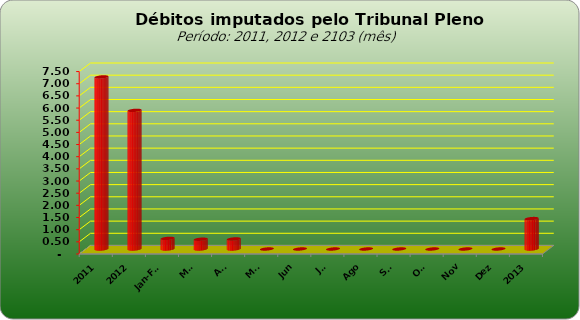
| Category |  7.073.154,74   5.698.720,25   436.112,79   401.482,76   413.229,26   -     -     -     -     -     -     -     -     1.250.824,81  |
|---|---|
| 2011 | 7073154.74 |
| 2012 | 5698720.25 |
| Jan-Fev | 436112.79 |
| Mar | 401482.76 |
| Abr | 413229.26 |
| Mai | 0 |
| Jun | 0 |
| Jul | 0 |
| Ago | 0 |
| Set | 0 |
| Out | 0 |
| Nov | 0 |
| Dez | 0 |
| 2013 | 1250824.81 |